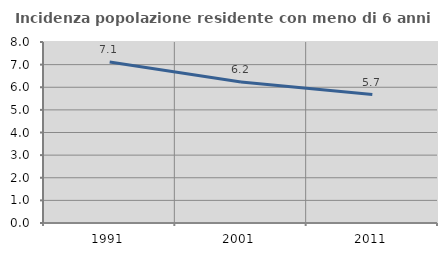
| Category | Incidenza popolazione residente con meno di 6 anni |
|---|---|
| 1991.0 | 7.12 |
| 2001.0 | 6.233 |
| 2011.0 | 5.677 |